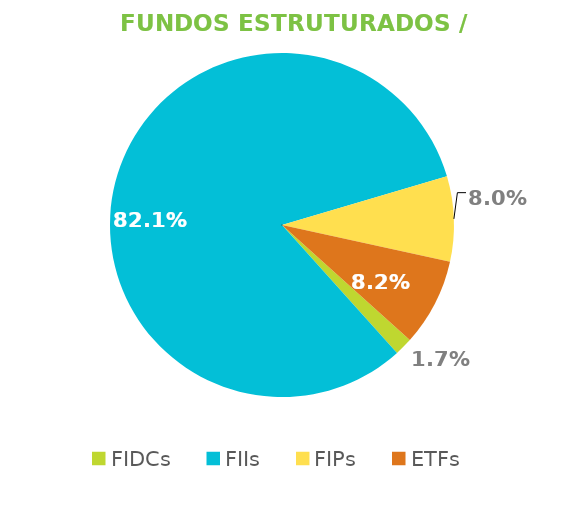
| Category | Fundos Estruturados / ETFs |
|---|---|
| FIDCs | 0.017 |
| FIIs | 0.821 |
| FIPs | 0.08 |
| ETFs | 0.082 |